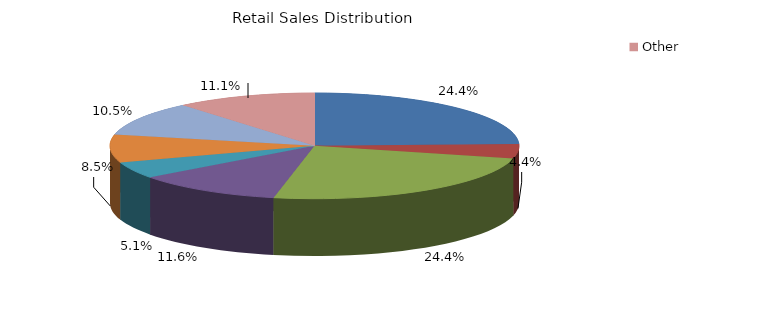
| Category | Series 0 |
|---|---|
| Food | 0.244 |
| Apparel | 0.044 |
| Gen.Merch. | 0.244 |
| Auto | 0.116 |
| Furniture | 0.051 |
| Build Materials | 0.085 |
| Service | 0.105 |
| Other | 0.111 |